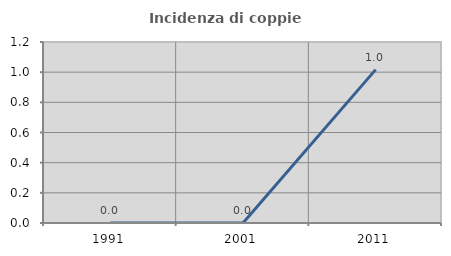
| Category | Incidenza di coppie miste |
|---|---|
| 1991.0 | 0 |
| 2001.0 | 0 |
| 2011.0 | 1.017 |